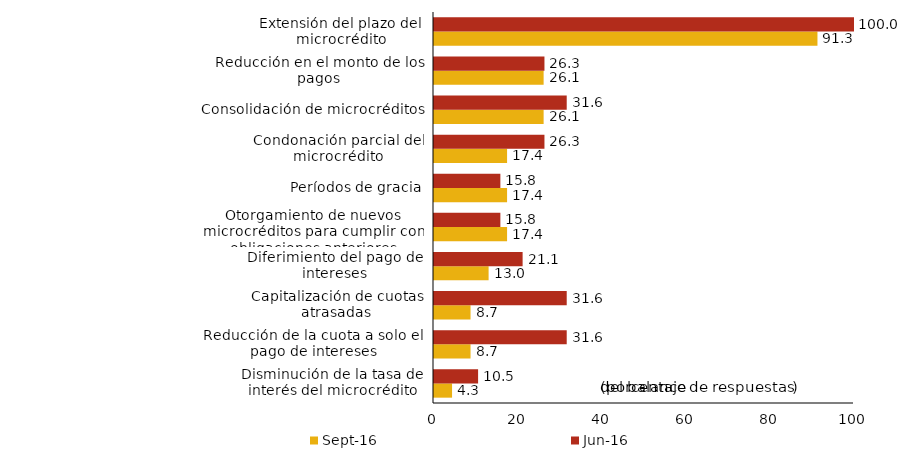
| Category | sep-16 | jun-16 |
|---|---|---|
| Disminución de la tasa de interés del microcrédito | 4.3 | 10.5 |
| Reducción de la cuota a solo el pago de intereses | 8.7 | 31.6 |
| Capitalización de cuotas atrasadas | 8.7 | 31.6 |
| Diferimiento del pago de intereses | 13 | 21.1 |
| Otorgamiento de nuevos microcréditos para cumplir con obligaciones anteriores | 17.4 | 15.8 |
| Períodos de gracia | 17.4 | 15.8 |
| Condonación parcial del microcrédito | 17.4 | 26.3 |
| Consolidación de microcréditos | 26.1 | 31.6 |
| Reducción en el monto de los pagos | 26.1 | 26.3 |
| Extensión del plazo del microcrédito | 91.3 | 100 |